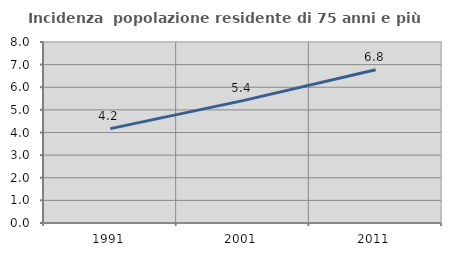
| Category | Incidenza  popolazione residente di 75 anni e più |
|---|---|
| 1991.0 | 4.17 |
| 2001.0 | 5.41 |
| 2011.0 | 6.772 |